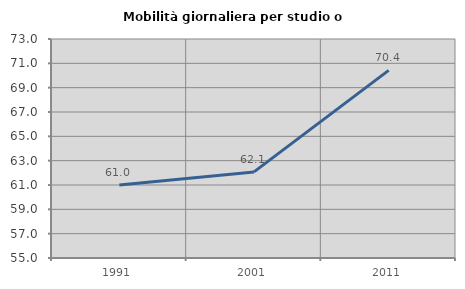
| Category | Mobilità giornaliera per studio o lavoro |
|---|---|
| 1991.0 | 61 |
| 2001.0 | 62.076 |
| 2011.0 | 70.424 |